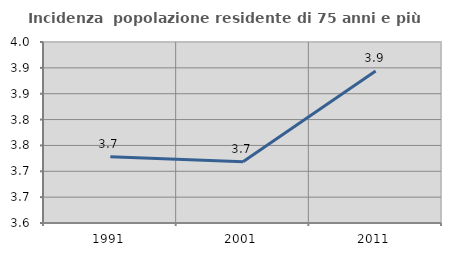
| Category | Incidenza  popolazione residente di 75 anni e più |
|---|---|
| 1991.0 | 3.728 |
| 2001.0 | 3.718 |
| 2011.0 | 3.894 |